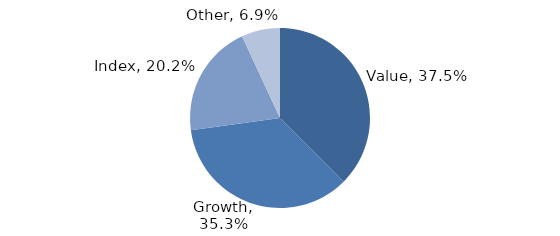
| Category | Investment Style |
|---|---|
| Value | 0.375 |
| Growth | 0.353 |
| Index | 0.202 |
| Other | 0.069 |